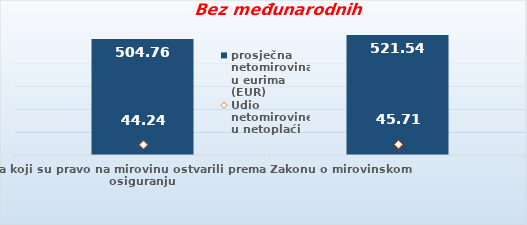
| Category | prosječna netomirovina u eurima (EUR) |
|---|---|
| Korisnici mirovina koji su pravo na mirovinu ostvarili prema Zakonu o mirovinskom osiguranju  | 504.76 |
| Korisnici koji su pravo na mirovinu PRVI PUT ostvarili u 2023. godini prema Zakonu o mirovinskom osiguranju - NOVI KORISNICI | 521.536 |